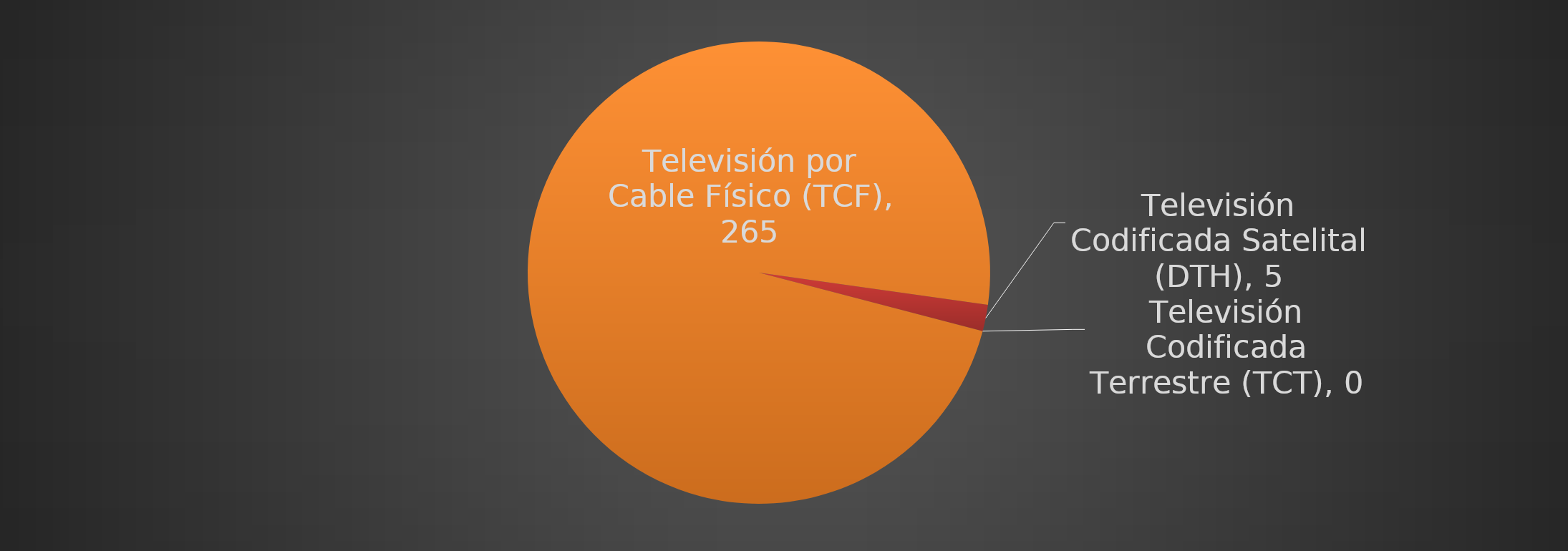
| Category | Televisión Codificada Satelital (DTH) |
|---|---|
| Televisión Codificada Satelital (DTH) | 5 |
| Televisión Codificada Terrestre (TCT) | 0 |
| Televisión por Cable Físico (TCF) | 265 |